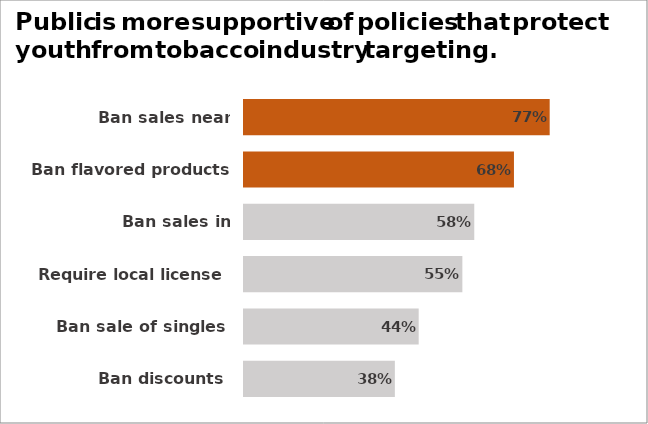
| Category | Support |
|---|---|
| Ban discounts | 0.38 |
| Ban sale of singles | 0.44 |
| Require local license | 0.55 |
| Ban sales in pharmacies | 0.58 |
| Ban flavored products | 0.68 |
| Ban sales near schools | 0.77 |